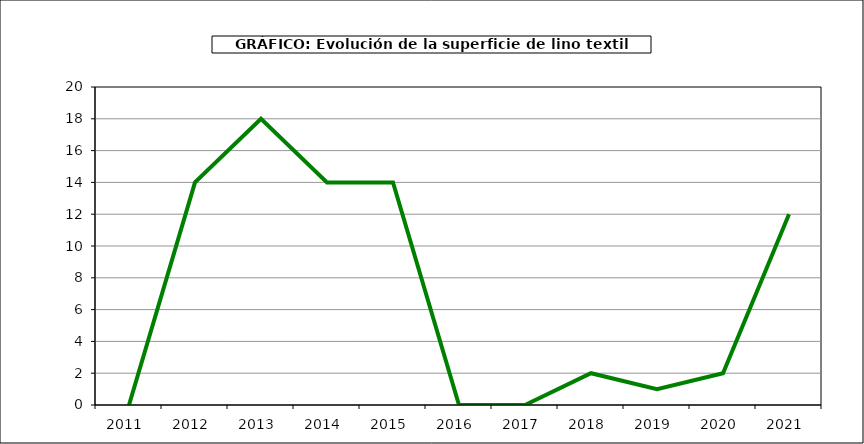
| Category | Superficie |
|---|---|
| 2011.0 | 0 |
| 2012.0 | 14 |
| 2013.0 | 18 |
| 2014.0 | 14 |
| 2015.0 | 14 |
| 2016.0 | 0 |
| 2017.0 | 0 |
| 2018.0 | 2 |
| 2019.0 | 1 |
| 2020.0 | 2 |
| 2021.0 | 12 |